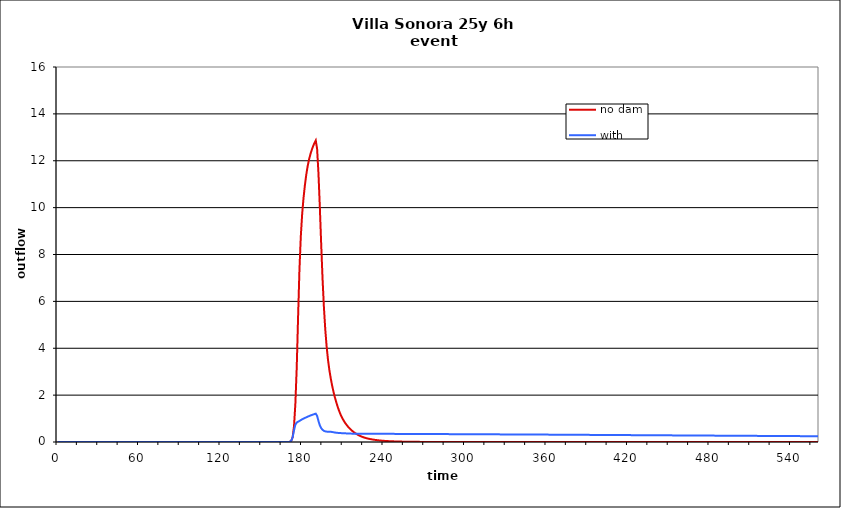
| Category | no dam | with dam |
|---|---|---|
| 0.0 | 0 | 0 |
| 1.0 | 0 | 0 |
| 2.0 | 0 | 0 |
| 3.0 | 0 | 0 |
| 4.0 | 0 | 0 |
| 5.0 | 0 | 0 |
| 6.0 | 0 | 0 |
| 7.0 | 0 | 0 |
| 8.0 | 0 | 0 |
| 9.0 | 0 | 0 |
| 10.0 | 0 | 0 |
| 11.0 | 0 | 0 |
| 12.0 | 0 | 0 |
| 13.0 | 0 | 0 |
| 14.0 | 0 | 0 |
| 15.0 | 0 | 0 |
| 16.0 | 0 | 0 |
| 17.0 | 0 | 0 |
| 18.0 | 0 | 0 |
| 19.0 | 0 | 0 |
| 20.0 | 0 | 0 |
| 21.0 | 0 | 0 |
| 22.0 | 0 | 0 |
| 23.0 | 0 | 0 |
| 24.0 | 0 | 0 |
| 25.0 | 0 | 0 |
| 26.0 | 0 | 0 |
| 27.0 | 0 | 0 |
| 28.0 | 0 | 0 |
| 29.0 | 0 | 0 |
| 30.0 | 0 | 0 |
| 31.0 | 0 | 0 |
| 32.0 | 0 | 0 |
| 33.0 | 0 | 0 |
| 34.0 | 0 | 0 |
| 35.0 | 0 | 0 |
| 36.0 | 0 | 0 |
| 37.0 | 0 | 0 |
| 38.0 | 0 | 0 |
| 39.0 | 0 | 0 |
| 40.0 | 0 | 0 |
| 41.0 | 0 | 0 |
| 42.0 | 0 | 0 |
| 43.0 | 0 | 0 |
| 44.0 | 0 | 0 |
| 45.0 | 0 | 0 |
| 46.0 | 0 | 0 |
| 47.0 | 0 | 0 |
| 48.0 | 0 | 0 |
| 49.0 | 0 | 0 |
| 50.0 | 0 | 0 |
| 51.0 | 0 | 0 |
| 52.0 | 0 | 0 |
| 53.0 | 0 | 0 |
| 54.0 | 0 | 0 |
| 55.0 | 0 | 0 |
| 56.0 | 0 | 0 |
| 57.0 | 0 | 0 |
| 58.0 | 0 | 0 |
| 59.0 | 0 | 0 |
| 60.0 | 0 | 0 |
| 61.0 | 0 | 0 |
| 62.0 | 0 | 0 |
| 63.0 | 0 | 0 |
| 64.0 | 0 | 0 |
| 65.0 | 0 | 0 |
| 66.0 | 0 | 0 |
| 67.0 | 0 | 0 |
| 68.0 | 0 | 0 |
| 69.0 | 0 | 0 |
| 70.0 | 0 | 0 |
| 71.0 | 0 | 0 |
| 72.0 | 0 | 0 |
| 73.0 | 0 | 0 |
| 74.0 | 0 | 0 |
| 75.0 | 0 | 0 |
| 76.0 | 0 | 0 |
| 77.0 | 0 | 0 |
| 78.0 | 0 | 0 |
| 79.0 | 0 | 0 |
| 80.0 | 0 | 0 |
| 81.0 | 0 | 0 |
| 82.0 | 0 | 0 |
| 83.0 | 0 | 0 |
| 84.0 | 0 | 0 |
| 85.0 | 0 | 0 |
| 86.0 | 0 | 0 |
| 87.0 | 0 | 0 |
| 88.0 | 0 | 0 |
| 89.0 | 0 | 0 |
| 90.0 | 0 | 0 |
| 91.0 | 0 | 0 |
| 92.0 | 0 | 0 |
| 93.0 | 0 | 0 |
| 94.0 | 0 | 0 |
| 95.0 | 0 | 0 |
| 96.0 | 0 | 0 |
| 97.0 | 0 | 0 |
| 98.0 | 0 | 0 |
| 99.0 | 0 | 0 |
| 100.0 | 0 | 0 |
| 101.0 | 0 | 0 |
| 102.0 | 0 | 0 |
| 103.0 | 0 | 0 |
| 104.0 | 0 | 0 |
| 105.0 | 0 | 0 |
| 106.0 | 0 | 0 |
| 107.0 | 0 | 0 |
| 108.0 | 0 | 0 |
| 109.0 | 0 | 0 |
| 110.0 | 0 | 0 |
| 111.0 | 0 | 0 |
| 112.0 | 0 | 0 |
| 113.0 | 0 | 0 |
| 114.0 | 0 | 0 |
| 115.0 | 0 | 0 |
| 116.0 | 0 | 0 |
| 117.0 | 0 | 0 |
| 118.0 | 0 | 0 |
| 119.0 | 0 | 0 |
| 120.0 | 0 | 0 |
| 121.0 | 0 | 0 |
| 122.0 | 0 | 0 |
| 123.0 | 0 | 0 |
| 124.0 | 0 | 0 |
| 125.0 | 0 | 0 |
| 126.0 | 0 | 0 |
| 127.0 | 0 | 0 |
| 128.0 | 0 | 0 |
| 129.0 | 0 | 0 |
| 130.0 | 0 | 0 |
| 131.0 | 0 | 0 |
| 132.0 | 0 | 0 |
| 133.0 | 0 | 0 |
| 134.0 | 0 | 0 |
| 135.0 | 0 | 0 |
| 136.0 | 0 | 0 |
| 137.0 | 0 | 0 |
| 138.0 | 0 | 0 |
| 139.0 | 0 | 0 |
| 140.0 | 0 | 0 |
| 141.0 | 0 | 0 |
| 142.0 | 0 | 0 |
| 143.0 | 0 | 0 |
| 144.0 | 0 | 0 |
| 145.0 | 0 | 0 |
| 146.0 | 0 | 0 |
| 147.0 | 0 | 0 |
| 148.0 | 0 | 0 |
| 149.0 | 0 | 0 |
| 150.0 | 0 | 0 |
| 151.0 | 0 | 0 |
| 152.0 | 0 | 0 |
| 153.0 | 0 | 0 |
| 154.0 | 0 | 0 |
| 155.0 | 0 | 0 |
| 156.0 | 0 | 0 |
| 157.0 | 0 | 0 |
| 158.0 | 0 | 0 |
| 159.0 | 0 | 0 |
| 160.0 | 0 | 0 |
| 161.0 | 0 | 0 |
| 162.0 | 0 | 0 |
| 163.0 | 0 | 0 |
| 164.0 | 0 | 0 |
| 165.0 | 0 | 0 |
| 166.0 | 0 | 0 |
| 167.0 | 0 | 0 |
| 168.0 | 0.001 | 0.001 |
| 169.0 | 0.001 | 0.001 |
| 170.0 | 0.002 | 0.002 |
| 171.0 | 0.009 | 0.009 |
| 172.0 | 0.055 | 0.055 |
| 173.0 | 0.206 | 0.206 |
| 174.0 | 0.677 | 0.504 |
| 175.0 | 1.64 | 0.739 |
| 176.0 | 3.189 | 0.83 |
| 177.0 | 5.344 | 0.867 |
| 178.0 | 7.363 | 0.898 |
| 179.0 | 8.776 | 0.934 |
| 180.0 | 9.732 | 0.968 |
| 181.0 | 10.412 | 0.998 |
| 182.0 | 10.953 | 1.025 |
| 183.0 | 11.398 | 1.053 |
| 184.0 | 11.756 | 1.079 |
| 185.0 | 12.04 | 1.105 |
| 186.0 | 12.265 | 1.128 |
| 187.0 | 12.454 | 1.15 |
| 188.0 | 12.614 | 1.171 |
| 189.0 | 12.751 | 1.191 |
| 190.0 | 12.868 | 1.21 |
| 191.0 | 12.507 | 1.116 |
| 192.0 | 11.461 | 0.895 |
| 193.0 | 10.032 | 0.709 |
| 194.0 | 8.44 | 0.59 |
| 195.0 | 6.972 | 0.52 |
| 196.0 | 5.76 | 0.477 |
| 197.0 | 4.808 | 0.454 |
| 198.0 | 4.079 | 0.443 |
| 199.0 | 3.517 | 0.439 |
| 200.0 | 3.077 | 0.439 |
| 201.0 | 2.728 | 0.436 |
| 202.0 | 2.423 | 0.427 |
| 203.0 | 2.158 | 0.416 |
| 204.0 | 1.925 | 0.405 |
| 205.0 | 1.717 | 0.397 |
| 206.0 | 1.529 | 0.391 |
| 207.0 | 1.359 | 0.385 |
| 208.0 | 1.209 | 0.381 |
| 209.0 | 1.079 | 0.378 |
| 210.0 | 0.968 | 0.376 |
| 211.0 | 0.872 | 0.373 |
| 212.0 | 0.786 | 0.369 |
| 213.0 | 0.707 | 0.365 |
| 214.0 | 0.637 | 0.362 |
| 215.0 | 0.574 | 0.359 |
| 216.0 | 0.518 | 0.358 |
| 217.0 | 0.467 | 0.356 |
| 218.0 | 0.421 | 0.355 |
| 219.0 | 0.38 | 0.355 |
| 220.0 | 0.342 | 0.354 |
| 221.0 | 0.308 | 0.354 |
| 222.0 | 0.278 | 0.353 |
| 223.0 | 0.251 | 0.352 |
| 224.0 | 0.226 | 0.351 |
| 225.0 | 0.204 | 0.351 |
| 226.0 | 0.185 | 0.351 |
| 227.0 | 0.167 | 0.35 |
| 228.0 | 0.152 | 0.35 |
| 229.0 | 0.138 | 0.35 |
| 230.0 | 0.126 | 0.35 |
| 231.0 | 0.115 | 0.35 |
| 232.0 | 0.105 | 0.35 |
| 233.0 | 0.096 | 0.35 |
| 234.0 | 0.087 | 0.35 |
| 235.0 | 0.08 | 0.349 |
| 236.0 | 0.073 | 0.349 |
| 237.0 | 0.067 | 0.349 |
| 238.0 | 0.061 | 0.349 |
| 239.0 | 0.056 | 0.349 |
| 240.0 | 0.051 | 0.348 |
| 241.0 | 0.046 | 0.348 |
| 242.0 | 0.043 | 0.348 |
| 243.0 | 0.039 | 0.348 |
| 244.0 | 0.036 | 0.348 |
| 245.0 | 0.033 | 0.347 |
| 246.0 | 0.03 | 0.347 |
| 247.0 | 0.028 | 0.347 |
| 248.0 | 0.026 | 0.347 |
| 249.0 | 0.023 | 0.346 |
| 250.0 | 0.022 | 0.346 |
| 251.0 | 0.02 | 0.346 |
| 252.0 | 0.018 | 0.346 |
| 253.0 | 0.017 | 0.345 |
| 254.0 | 0.015 | 0.345 |
| 255.0 | 0.014 | 0.345 |
| 256.0 | 0.013 | 0.345 |
| 257.0 | 0.012 | 0.344 |
| 258.0 | 0.011 | 0.344 |
| 259.0 | 0.01 | 0.344 |
| 260.0 | 0.009 | 0.344 |
| 261.0 | 0.009 | 0.343 |
| 262.0 | 0.008 | 0.343 |
| 263.0 | 0.007 | 0.343 |
| 264.0 | 0.007 | 0.343 |
| 265.0 | 0.006 | 0.342 |
| 266.0 | 0.006 | 0.342 |
| 267.0 | 0.005 | 0.342 |
| 268.0 | 0.005 | 0.341 |
| 269.0 | 0.004 | 0.341 |
| 270.0 | 0.004 | 0.341 |
| 271.0 | 0.003 | 0.341 |
| 272.0 | 0.003 | 0.34 |
| 273.0 | 0.003 | 0.34 |
| 274.0 | 0.002 | 0.34 |
| 275.0 | 0.002 | 0.34 |
| 276.0 | 0.002 | 0.339 |
| 277.0 | 0.002 | 0.339 |
| 278.0 | 0.001 | 0.339 |
| 279.0 | 0.001 | 0.338 |
| 280.0 | 0.001 | 0.338 |
| 281.0 | 0.001 | 0.338 |
| 282.0 | 0.001 | 0.338 |
| 283.0 | 0.001 | 0.337 |
| 284.0 | 0.001 | 0.337 |
| 285.0 | 0.001 | 0.337 |
| 286.0 | 0.001 | 0.336 |
| 287.0 | 0 | 0.336 |
| 288.0 | 0 | 0.336 |
| 289.0 | 0 | 0.336 |
| 290.0 | 0 | 0.335 |
| 291.0 | 0 | 0.335 |
| 292.0 | 0 | 0.335 |
| 293.0 | 0 | 0.335 |
| 294.0 | 0 | 0.334 |
| 295.0 | 0 | 0.334 |
| 296.0 | 0 | 0.334 |
| 297.0 | 0 | 0.333 |
| 298.0 | 0 | 0.333 |
| 299.0 | 0 | 0.333 |
| 300.0 | 0 | 0.333 |
| 301.0 | 0 | 0.332 |
| 302.0 | 0 | 0.332 |
| 303.0 | 0 | 0.332 |
| 304.0 | 0 | 0.331 |
| 305.0 | 0 | 0.331 |
| 306.0 | 0 | 0.331 |
| 307.0 | 0 | 0.331 |
| 308.0 | 0 | 0.33 |
| 309.0 | 0 | 0.33 |
| 310.0 | 0 | 0.33 |
| 311.0 | 0 | 0.329 |
| 312.0 | 0 | 0.329 |
| 313.0 | 0 | 0.329 |
| 314.0 | 0 | 0.329 |
| 315.0 | 0 | 0.328 |
| 316.0 | 0 | 0.328 |
| 317.0 | 0 | 0.328 |
| 318.0 | 0 | 0.327 |
| 319.0 | 0 | 0.327 |
| 320.0 | 0 | 0.327 |
| 321.0 | 0 | 0.327 |
| 322.0 | 0 | 0.326 |
| 323.0 | 0 | 0.326 |
| 324.0 | 0 | 0.326 |
| 325.0 | 0 | 0.325 |
| 326.0 | 0 | 0.325 |
| 327.0 | 0 | 0.325 |
| 328.0 | 0 | 0.324 |
| 329.0 | 0 | 0.324 |
| 330.0 | 0 | 0.324 |
| 331.0 | 0 | 0.324 |
| 332.0 | 0 | 0.323 |
| 333.0 | 0 | 0.323 |
| 334.0 | 0 | 0.323 |
| 335.0 | 0 | 0.322 |
| 336.0 | 0 | 0.322 |
| 337.0 | 0 | 0.322 |
| 338.0 | 0 | 0.322 |
| 339.0 | 0 | 0.321 |
| 340.0 | 0 | 0.321 |
| 341.0 | 0 | 0.321 |
| 342.0 | 0 | 0.32 |
| 343.0 | 0 | 0.32 |
| 344.0 | 0 | 0.32 |
| 345.0 | 0 | 0.32 |
| 346.0 | 0 | 0.319 |
| 347.0 | 0 | 0.319 |
| 348.0 | 0 | 0.319 |
| 349.0 | 0 | 0.318 |
| 350.0 | 0 | 0.318 |
| 351.0 | 0 | 0.318 |
| 352.0 | 0 | 0.317 |
| 353.0 | 0 | 0.317 |
| 354.0 | 0 | 0.317 |
| 355.0 | 0 | 0.317 |
| 356.0 | 0 | 0.316 |
| 357.0 | 0 | 0.316 |
| 358.0 | 0 | 0.316 |
| 359.0 | 0 | 0.315 |
| 360.0 | 0 | 0.315 |
| 361.0 | 0 | 0.315 |
| 362.0 | 0 | 0.314 |
| 363.0 | 0 | 0.314 |
| 364.0 | 0 | 0.314 |
| 365.0 | 0 | 0.313 |
| 366.0 | 0 | 0.313 |
| 367.0 | 0 | 0.313 |
| 368.0 | 0 | 0.312 |
| 369.0 | 0 | 0.312 |
| 370.0 | 0 | 0.311 |
| 371.0 | 0 | 0.311 |
| 372.0 | 0 | 0.311 |
| 373.0 | 0 | 0.31 |
| 374.0 | 0 | 0.31 |
| 375.0 | 0 | 0.31 |
| 376.0 | 0 | 0.309 |
| 377.0 | 0 | 0.309 |
| 378.0 | 0 | 0.309 |
| 379.0 | 0 | 0.308 |
| 380.0 | 0 | 0.308 |
| 381.0 | 0 | 0.308 |
| 382.0 | 0 | 0.307 |
| 383.0 | 0 | 0.307 |
| 384.0 | 0 | 0.307 |
| 385.0 | 0 | 0.306 |
| 386.0 | 0 | 0.306 |
| 387.0 | 0 | 0.306 |
| 388.0 | 0 | 0.305 |
| 389.0 | 0 | 0.305 |
| 390.0 | 0 | 0.304 |
| 391.0 | 0 | 0.304 |
| 392.0 | 0 | 0.304 |
| 393.0 | 0 | 0.303 |
| 394.0 | 0 | 0.303 |
| 395.0 | 0 | 0.303 |
| 396.0 | 0 | 0.302 |
| 397.0 | 0 | 0.302 |
| 398.0 | 0 | 0.302 |
| 399.0 | 0 | 0.301 |
| 400.0 | 0 | 0.301 |
| 401.0 | 0 | 0.301 |
| 402.0 | 0 | 0.3 |
| 403.0 | 0 | 0.3 |
| 404.0 | 0 | 0.3 |
| 405.0 | 0 | 0.299 |
| 406.0 | 0 | 0.299 |
| 407.0 | 0 | 0.298 |
| 408.0 | 0 | 0.298 |
| 409.0 | 0 | 0.298 |
| 410.0 | 0 | 0.297 |
| 411.0 | 0 | 0.297 |
| 412.0 | 0 | 0.297 |
| 413.0 | 0 | 0.296 |
| 414.0 | 0 | 0.296 |
| 415.0 | 0 | 0.296 |
| 416.0 | 0 | 0.295 |
| 417.0 | 0 | 0.295 |
| 418.0 | 0 | 0.295 |
| 419.0 | 0 | 0.294 |
| 420.0 | 0 | 0.294 |
| 421.0 | 0 | 0.294 |
| 422.0 | 0 | 0.293 |
| 423.0 | 0 | 0.293 |
| 424.0 | 0 | 0.293 |
| 425.0 | 0 | 0.292 |
| 426.0 | 0 | 0.292 |
| 427.0 | 0 | 0.291 |
| 428.0 | 0 | 0.291 |
| 429.0 | 0 | 0.291 |
| 430.0 | 0 | 0.29 |
| 431.0 | 0 | 0.29 |
| 432.0 | 0 | 0.29 |
| 433.0 | 0 | 0.289 |
| 434.0 | 0 | 0.289 |
| 435.0 | 0 | 0.289 |
| 436.0 | 0 | 0.288 |
| 437.0 | 0 | 0.288 |
| 438.0 | 0 | 0.288 |
| 439.0 | 0 | 0.287 |
| 440.0 | 0 | 0.287 |
| 441.0 | 0 | 0.287 |
| 442.0 | 0 | 0.286 |
| 443.0 | 0 | 0.286 |
| 444.0 | 0 | 0.286 |
| 445.0 | 0 | 0.285 |
| 446.0 | 0 | 0.285 |
| 447.0 | 0 | 0.285 |
| 448.0 | 0 | 0.284 |
| 449.0 | 0 | 0.284 |
| 450.0 | 0 | 0.284 |
| 451.0 | 0 | 0.283 |
| 452.0 | 0 | 0.283 |
| 453.0 | 0 | 0.282 |
| 454.0 | 0 | 0.282 |
| 455.0 | 0 | 0.282 |
| 456.0 | 0 | 0.281 |
| 457.0 | 0 | 0.281 |
| 458.0 | 0 | 0.281 |
| 459.0 | 0 | 0.28 |
| 460.0 | 0 | 0.28 |
| 461.0 | 0 | 0.28 |
| 462.0 | 0 | 0.279 |
| 463.0 | 0 | 0.279 |
| 464.0 | 0 | 0.279 |
| 465.0 | 0 | 0.278 |
| 466.0 | 0 | 0.278 |
| 467.0 | 0 | 0.278 |
| 468.0 | 0 | 0.277 |
| 469.0 | 0 | 0.277 |
| 470.0 | 0 | 0.277 |
| 471.0 | 0 | 0.276 |
| 472.0 | 0 | 0.276 |
| 473.0 | 0 | 0.276 |
| 474.0 | 0 | 0.275 |
| 475.0 | 0 | 0.275 |
| 476.0 | 0 | 0.275 |
| 477.0 | 0 | 0.274 |
| 478.0 | 0 | 0.274 |
| 479.0 | 0 | 0.274 |
| 480.0 | 0 | 0.273 |
| 481.0 | 0 | 0.273 |
| 482.0 | 0 | 0.272 |
| 483.0 | 0 | 0.272 |
| 484.0 | 0 | 0.272 |
| 485.0 | 0 | 0.271 |
| 486.0 | 0 | 0.271 |
| 487.0 | 0 | 0.271 |
| 488.0 | 0 | 0.27 |
| 489.0 | 0 | 0.27 |
| 490.0 | 0 | 0.27 |
| 491.0 | 0 | 0.269 |
| 492.0 | 0 | 0.269 |
| 493.0 | 0 | 0.269 |
| 494.0 | 0 | 0.268 |
| 495.0 | 0 | 0.268 |
| 496.0 | 0 | 0.268 |
| 497.0 | 0 | 0.267 |
| 498.0 | 0 | 0.267 |
| 499.0 | 0 | 0.267 |
| 500.0 | 0 | 0.266 |
| 501.0 | 0 | 0.266 |
| 502.0 | 0 | 0.266 |
| 503.0 | 0 | 0.265 |
| 504.0 | 0 | 0.265 |
| 505.0 | 0 | 0.265 |
| 506.0 | 0 | 0.264 |
| 507.0 | 0 | 0.264 |
| 508.0 | 0 | 0.264 |
| 509.0 | 0 | 0.263 |
| 510.0 | 0 | 0.263 |
| 511.0 | 0 | 0.263 |
| 512.0 | 0 | 0.262 |
| 513.0 | 0 | 0.262 |
| 514.0 | 0 | 0.262 |
| 515.0 | 0 | 0.261 |
| 516.0 | 0 | 0.261 |
| 517.0 | 0 | 0.261 |
| 518.0 | 0 | 0.26 |
| 519.0 | 0 | 0.26 |
| 520.0 | 0 | 0.26 |
| 521.0 | 0 | 0.259 |
| 522.0 | 0 | 0.259 |
| 523.0 | 0 | 0.259 |
| 524.0 | 0 | 0.258 |
| 525.0 | 0 | 0.258 |
| 526.0 | 0 | 0.258 |
| 527.0 | 0 | 0.257 |
| 528.0 | 0 | 0.257 |
| 529.0 | 0 | 0.256 |
| 530.0 | 0 | 0.256 |
| 531.0 | 0 | 0.256 |
| 532.0 | 0 | 0.255 |
| 533.0 | 0 | 0.255 |
| 534.0 | 0 | 0.255 |
| 535.0 | 0 | 0.254 |
| 536.0 | 0 | 0.254 |
| 537.0 | 0 | 0.254 |
| 538.0 | 0 | 0.253 |
| 539.0 | 0 | 0.253 |
| 540.0 | 0 | 0.253 |
| 541.0 | 0 | 0.252 |
| 542.0 | 0 | 0.252 |
| 543.0 | 0 | 0.252 |
| 544.0 | 0 | 0.251 |
| 545.0 | 0 | 0.251 |
| 546.0 | 0 | 0.251 |
| 547.0 | 0 | 0.25 |
| 548.0 | 0 | 0.25 |
| 549.0 | 0 | 0.25 |
| 550.0 | 0 | 0.249 |
| 551.0 | 0 | 0.249 |
| 552.0 | 0 | 0.249 |
| 553.0 | 0 | 0.248 |
| 554.0 | 0 | 0.248 |
| 555.0 | 0 | 0.248 |
| 556.0 | 0 | 0.247 |
| 557.0 | 0 | 0.247 |
| 558.0 | 0 | 0.246 |
| 559.0 | 0 | 0.246 |
| 560.0 | 0 | 0.246 |